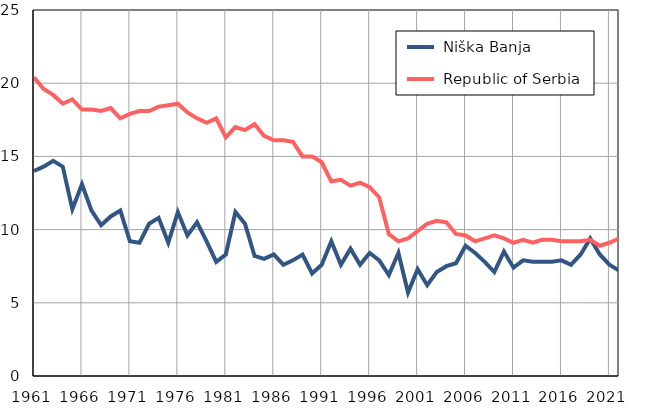
| Category |  Niška Banja |  Republic of Serbia |
|---|---|---|
| 1961.0 | 14 | 20.4 |
| 1962.0 | 14.3 | 19.6 |
| 1963.0 | 14.7 | 19.2 |
| 1964.0 | 14.3 | 18.6 |
| 1965.0 | 11.4 | 18.9 |
| 1966.0 | 13.1 | 18.2 |
| 1967.0 | 11.3 | 18.2 |
| 1968.0 | 10.3 | 18.1 |
| 1969.0 | 10.9 | 18.3 |
| 1970.0 | 11.3 | 17.6 |
| 1971.0 | 9.2 | 17.9 |
| 1972.0 | 9.1 | 18.1 |
| 1973.0 | 10.4 | 18.1 |
| 1974.0 | 10.8 | 18.4 |
| 1975.0 | 9.1 | 18.5 |
| 1976.0 | 11.2 | 18.6 |
| 1977.0 | 9.6 | 18 |
| 1978.0 | 10.5 | 17.6 |
| 1979.0 | 9.2 | 17.3 |
| 1980.0 | 7.8 | 17.6 |
| 1981.0 | 8.3 | 16.3 |
| 1982.0 | 11.2 | 17 |
| 1983.0 | 10.4 | 16.8 |
| 1984.0 | 8.2 | 17.2 |
| 1985.0 | 8 | 16.4 |
| 1986.0 | 8.3 | 16.1 |
| 1987.0 | 7.6 | 16.1 |
| 1988.0 | 7.9 | 16 |
| 1989.0 | 8.3 | 15 |
| 1990.0 | 7 | 15 |
| 1991.0 | 7.6 | 14.6 |
| 1992.0 | 9.2 | 13.3 |
| 1993.0 | 7.6 | 13.4 |
| 1994.0 | 8.7 | 13 |
| 1995.0 | 7.6 | 13.2 |
| 1996.0 | 8.4 | 12.9 |
| 1997.0 | 7.9 | 12.2 |
| 1998.0 | 6.9 | 9.7 |
| 1999.0 | 8.4 | 9.2 |
| 2000.0 | 5.7 | 9.4 |
| 2001.0 | 7.3 | 9.9 |
| 2002.0 | 6.2 | 10.4 |
| 2003.0 | 7.1 | 10.6 |
| 2004.0 | 7.5 | 10.5 |
| 2005.0 | 7.7 | 9.7 |
| 2006.0 | 8.9 | 9.6 |
| 2007.0 | 8.4 | 9.2 |
| 2008.0 | 7.8 | 9.4 |
| 2009.0 | 7.1 | 9.6 |
| 2010.0 | 8.5 | 9.4 |
| 2011.0 | 7.4 | 9.1 |
| 2012.0 | 7.9 | 9.3 |
| 2013.0 | 7.8 | 9.1 |
| 2014.0 | 7.8 | 9.3 |
| 2015.0 | 7.8 | 9.3 |
| 2016.0 | 7.9 | 9.2 |
| 2017.0 | 7.6 | 9.2 |
| 2018.0 | 8.3 | 9.2 |
| 2019.0 | 9.4 | 9.3 |
| 2020.0 | 8.3 | 8.9 |
| 2021.0 | 7.6 | 9.1 |
| 2022.0 | 7.2 | 9.4 |